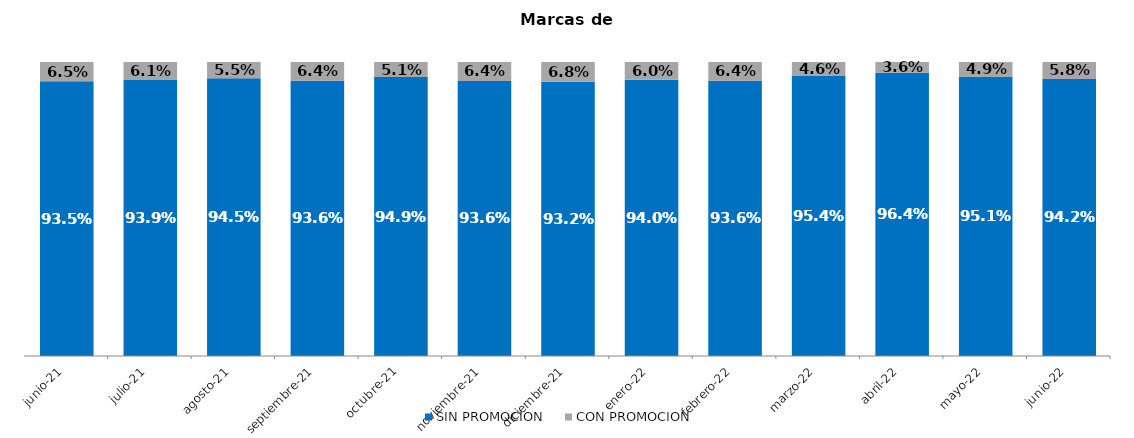
| Category | SIN PROMOCION   | CON PROMOCION   |
|---|---|---|
| 2021-06-01 | 0.935 | 0.065 |
| 2021-07-01 | 0.939 | 0.061 |
| 2021-08-01 | 0.945 | 0.055 |
| 2021-09-01 | 0.936 | 0.064 |
| 2021-10-01 | 0.949 | 0.051 |
| 2021-11-01 | 0.936 | 0.064 |
| 2021-12-01 | 0.932 | 0.068 |
| 2022-01-01 | 0.94 | 0.06 |
| 2022-02-01 | 0.936 | 0.064 |
| 2022-03-01 | 0.954 | 0.046 |
| 2022-04-01 | 0.964 | 0.036 |
| 2022-05-01 | 0.951 | 0.049 |
| 2022-06-01 | 0.942 | 0.058 |